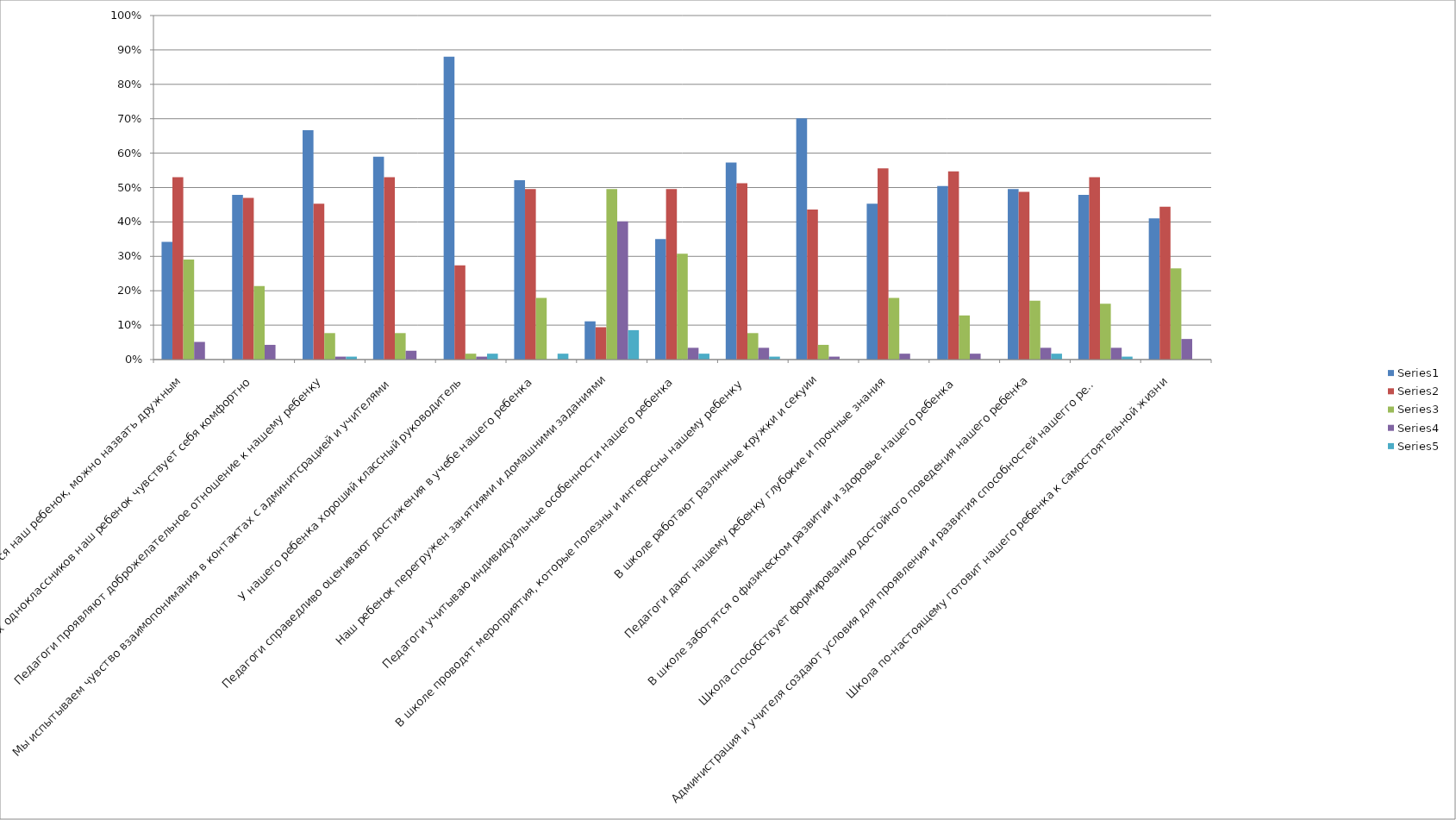
| Category | Series 0 | Series 1 | Series 2 | Series 3 | Series 4 |
|---|---|---|---|---|---|
| Класс, в котором учится наш ребенок, можно назвать дружным | 0.342 | 0.53 | 0.291 | 0.051 | 0 |
| В среде своих одноклассников наш ребенок чувствует себя комфортно | 0.479 | 0.47 | 0.214 | 0.043 | 0 |
| Педагоги проявляют доброжелательное отношение к нашему ребенку | 0.667 | 0.453 | 0.077 | 0.009 | 0.009 |
| Мы испытываем чувство взаимопонимания в контактах с админитсрацией и учителями | 0.59 | 0.53 | 0.077 | 0.026 | 0 |
| У нашего ребенка хороший классный руководитель | 0.88 | 0.274 | 0.017 | 0.009 | 0.017 |
| Педагоги справедливо оценивают достижения в учебе нашего ребенка | 0.521 | 0.496 | 0.179 | 0 | 0.017 |
| Наш ребенок перегружен занятиями и домашними заданиями | 0.111 | 0.094 | 0.496 | 0.402 | 0.085 |
| Педагоги учитываю индивидуальные особенности нашего ребенка | 0.35 | 0.496 | 0.308 | 0.034 | 0.017 |
| В школе проводят мероприятия, которые полезны и интересны нашему ребенку | 0.573 | 0.513 | 0.077 | 0.034 | 0.009 |
| В школе работают различные кружки и секуии | 0.701 | 0.436 | 0.043 | 0.009 | 0 |
| Педагоги дают нашему ребенку глубокие и прочные знания | 0.453 | 0.556 | 0.179 | 0.017 | 0 |
| В школе заботятся о физическом развитии и здоровье нашего ребенка | 0.504 | 0.547 | 0.128 | 0.017 | 0 |
| Школа способствует формированию достойного поведения нашего ребенка | 0.496 | 0.487 | 0.171 | 0.034 | 0.017 |
| Администрация и учителя создают условия для проявления и развития способностей нашегго ребенка | 0.479 | 0.53 | 0.162 | 0.034 | 0.009 |
| Школа по-настоящему готовит нашего ребенка к самостоятельной жизни | 0.41 | 0.444 | 0.265 | 0.06 | 0 |